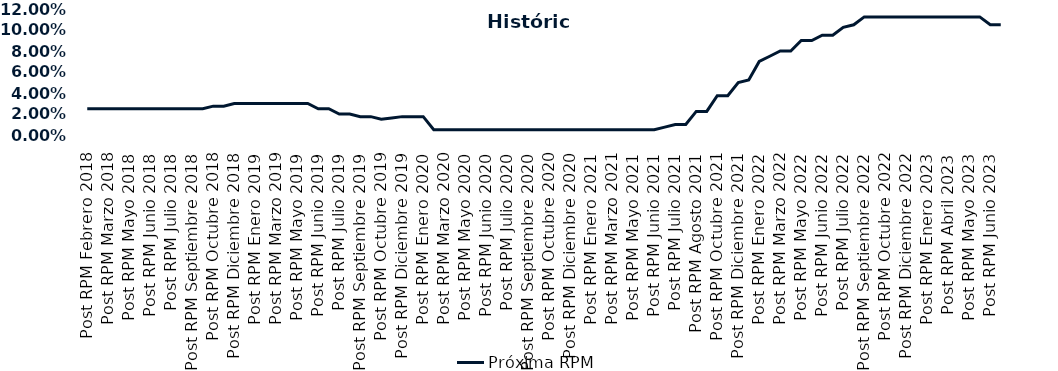
| Category | Próxima RPM |
|---|---|
| Post RPM Febrero 2018 | 0.025 |
| Pre RPM Marzo 2018 | 0.025 |
| Post RPM Marzo 2018 | 0.025 |
| Pre RPM Mayo 2018 | 0.025 |
| Post RPM Mayo 2018 | 0.025 |
| Pre RPM Junio 2018 | 0.025 |
| Post RPM Junio 2018 | 0.025 |
| Pre RPM Julio 2018 | 0.025 |
| Post RPM Julio 2018 | 0.025 |
| Pre RPM Septiembre 2018 | 0.025 |
| Post RPM Septiembre 2018 | 0.025 |
| Pre RPM Octubre 2018 | 0.025 |
| Post RPM Octubre 2018 | 0.028 |
| Pre RPM Diciembre 2018 | 0.028 |
| Post RPM Diciembre 2018 | 0.03 |
| Pre RPM Enero 2019 | 0.03 |
| Post RPM Enero 2019 | 0.03 |
| Pre RPM Marzo 2019 | 0.03 |
| Post RPM Marzo 2019 | 0.03 |
| Pre RPM Mayo 2019 | 0.03 |
| Post RPM Mayo 2019 | 0.03 |
| Pre RPM Junio 2019 | 0.03 |
| Post RPM Junio 2019 | 0.025 |
| Pre RPM Julio 2019 | 0.025 |
| Post RPM Julio 2019 | 0.02 |
| Pre RPM Septiembre 2019 | 0.02 |
| Post RPM Septiembre 2019 | 0.018 |
| Pre RPM Octubre 2019 | 0.018 |
| Post RPM Octubre 2019 | 0.015 |
| Pre RPM Diciembre 2019 | 0.016 |
| Post RPM Diciembre 2019 | 0.018 |
| Pre RPM Enero 2020 | 0.018 |
| Post RPM Enero 2020 | 0.018 |
| Pre RPM Marzo 2020 | 0.005 |
| Post RPM Marzo 2020 | 0.005 |
| Pre RPM Mayo 2020 | 0.005 |
| Post RPM Mayo 2020 | 0.005 |
| Pre RPM Junio 2020 | 0.005 |
| Post RPM Junio 2020 | 0.005 |
| Pre RPM Julio 2020 | 0.005 |
| Post RPM Julio 2020 | 0.005 |
| Pre RPM Septiembre 2020 | 0.005 |
| Post RPM Septiembre 2020 | 0.005 |
| Pre RPM Octubre 2020 | 0.005 |
| Post RPM Octubre 2020 | 0.005 |
| Pre RPM Diciembre 2020 | 0.005 |
| Post RPM Diciembre 2020 | 0.005 |
| Pre RPM Enero 2021 | 0.005 |
| Post RPM Enero 2021 | 0.005 |
| Pre RPM Marzo 2021 | 0.005 |
| Post RPM Marzo 2021 | 0.005 |
| Pre RPM Mayo 2021 | 0.005 |
| Post RPM Mayo 2021 | 0.005 |
| Pre RPM Junio 2021 | 0.005 |
| Post RPM Junio 2021 | 0.005 |
| Pre RPM Julio 2021 | 0.008 |
| Post RPM Julio 2021 | 0.01 |
| Pre RPM Agosto 2021 | 0.01 |
| Post RPM Agosto 2021 | 0.022 |
| Pre RPM Octubre 2021 | 0.022 |
| Post RPM Octubre 2021 | 0.038 |
| Pre RPM Diciembre 2021 | 0.038 |
| Post RPM Diciembre 2021 | 0.05 |
| Pre RPM Enero 2022 | 0.052 |
| Post RPM Enero 2022 | 0.07 |
| Pre RPM Marzo 2022 | 0.075 |
| Post RPM Marzo 2022 | 0.08 |
| Pre RPM Mayo 2022 | 0.08 |
| Post RPM Mayo 2022 | 0.09 |
| Pre RPM Junio 2022 | 0.09 |
| Post RPM Junio 2022 | 0.095 |
| Pre RPM Julio 2022 | 0.095 |
| Post RPM Julio 2022 | 0.102 |
| Pre RPM Septiembre 2022 | 0.105 |
| Post RPM Septiembre 2022 | 0.112 |
| Pre RPM Octubre 2022 | 0.112 |
| Post RPM Octubre 2022 | 0.112 |
| Pre RPM Diciembre 2022 | 0.112 |
| Post RPM Diciembre 2022 | 0.112 |
| Pre RPM Enero 2023 | 0.112 |
| Post RPM Enero 2023 | 0.112 |
| Pre RPM Abril 2023 | 0.112 |
| Post RPM Abril 2023 | 0.112 |
| Pre RPM Mayo 2023 | 0.112 |
| Post RPM Mayo 2023 | 0.112 |
| Pre RPM Junio 2023 | 0.112 |
| Post RPM Junio 2023 | 0.105 |
| Pre RPM Julio 2023 | 0.105 |